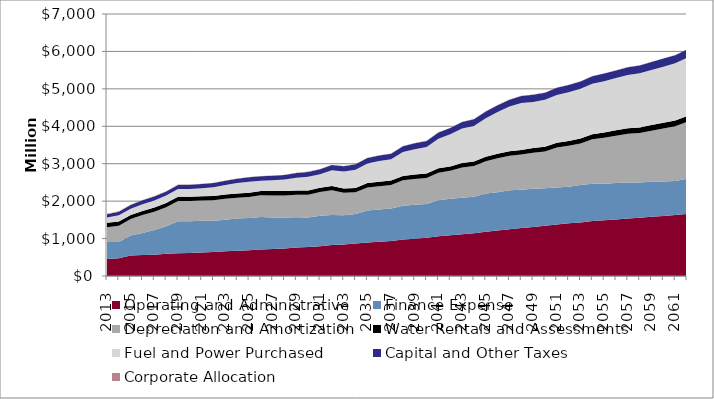
| Category | Operating and Administrative | Finance Expense | Depreciation and Amortization | Water Rentals and Assessments | Fuel and Power Purchased | Capital and Other Taxes | Corporate Allocation |
|---|---|---|---|---|---|---|---|
| 2013.0 | 455 | 451 | 399 | 117 | 143 | 87 | 9 |
| 2014.0 | 471 | 440 | 430 | 116 | 166 | 95 | 9 |
| 2015.0 | 546 | 536 | 439 | 112 | 167 | 99 | 8 |
| 2016.0 | 559 | 589 | 479 | 112 | 178 | 104 | 8 |
| 2017.0 | 570 | 658 | 488 | 112 | 191 | 108 | 8 |
| 2018.0 | 593 | 737 | 509 | 113 | 197 | 110 | 8 |
| 2019.0 | 605 | 857 | 544 | 112 | 206 | 110 | 8 |
| 2020.0 | 616 | 849 | 541 | 112 | 209 | 110 | 8 |
| 2021.0 | 628 | 849 | 537 | 114 | 218 | 111 | 8 |
| 2022.0 | 641 | 836 | 547 | 114 | 233 | 113 | 8 |
| 2023.0 | 660 | 844 | 558 | 113 | 257 | 114 | 8 |
| 2024.0 | 675 | 859 | 559 | 113 | 278 | 116 | 8 |
| 2025.0 | 690 | 857 | 564 | 113 | 296 | 118 | 8 |
| 2026.0 | 708 | 866 | 581 | 114 | 277 | 119 | 8 |
| 2027.0 | 721 | 843 | 590 | 115 | 286 | 121 | 8 |
| 2028.0 | 737 | 827 | 590 | 115 | 307 | 123 | 8 |
| 2029.0 | 761 | 811 | 598 | 114 | 339 | 128 | 8 |
| 2030.0 | 776 | 789 | 608 | 114 | 362 | 132 | 8 |
| 2031.0 | 792 | 815 | 635 | 118 | 357 | 135 | 7 |
| 2032.0 | 825 | 802 | 663 | 117 | 421 | 137 | 7 |
| 2033.0 | 844 | 779 | 598 | 116 | 454 | 139 | 7 |
| 2034.0 | 867 | 789 | 582 | 116 | 488 | 142 | 7 |
| 2035.0 | 894 | 857 | 615 | 116 | 527 | 145 | 7 |
| 2036.0 | 916 | 863 | 621 | 117 | 554 | 149 | 7 |
| 2037.0 | 936 | 867 | 627 | 119 | 568 | 152 | 7 |
| 2038.0 | 973 | 902 | 682 | 118 | 636 | 155 | 7 |
| 2039.0 | 997 | 905 | 690 | 118 | 678 | 159 | 7 |
| 2040.0 | 1020 | 903 | 696 | 120 | 706 | 163 | 7 |
| 2041.0 | 1060 | 967 | 733 | 119 | 787 | 165 | 7 |
| 2042.0 | 1087 | 975 | 747 | 118 | 861 | 169 | 7 |
| 2043.0 | 1114 | 975 | 813 | 119 | 921 | 174 | 7 |
| 2044.0 | 1141 | 975 | 823 | 121 | 949 | 178 | 7 |
| 2045.0 | 1185 | 1021 | 859 | 120 | 1033 | 180 | 6 |
| 2046.0 | 1216 | 1022 | 905 | 120 | 1119 | 183 | 6 |
| 2047.0 | 1247 | 1044 | 922 | 120 | 1194 | 185 | 6 |
| 2048.0 | 1281 | 1022 | 940 | 121 | 1259 | 187 | 6 |
| 2049.0 | 1311 | 1019 | 964 | 125 | 1233 | 188 | 6 |
| 2050.0 | 1343 | 1001 | 979 | 127 | 1256 | 190 | 6 |
| 2051.0 | 1376 | 989 | 1065 | 129 | 1278 | 192 | 6 |
| 2052.0 | 1410 | 977 | 1090 | 131 | 1301 | 195 | 6 |
| 2053.0 | 1432 | 998 | 1113 | 134 | 1325 | 197 | 6 |
| 2054.0 | 1467 | 996 | 1191 | 136 | 1348 | 200 | 6 |
| 2055.0 | 1489 | 978 | 1226 | 139 | 1373 | 202 | 6 |
| 2056.0 | 1512 | 976 | 1262 | 141 | 1397 | 204 | 6 |
| 2057.0 | 1535 | 961 | 1306 | 144 | 1423 | 206 | 6 |
| 2058.0 | 1558 | 937 | 1326 | 146 | 1448 | 208 | 6 |
| 2059.0 | 1582 | 933 | 1369 | 149 | 1474 | 211 | 6 |
| 2060.0 | 1606 | 918 | 1417 | 151 | 1501 | 215 | 6 |
| 2061.0 | 1631 | 908 | 1461 | 154 | 1528 | 218 | 6 |
| 2062.0 | 1656 | 942 | 1519 | 157 | 1555 | 219 | 6 |